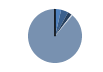
| Category | Series 0 |
|---|---|
| ARRASTRE | 40 |
| CERCO | 48 |
| PALANGRE | 26 |
| REDES DE ENMALLE | 6 |
| ARTES FIJAS | 2 |
| ARTES MENORES | 965 |
| SIN TIPO ASIGNADO | 1 |